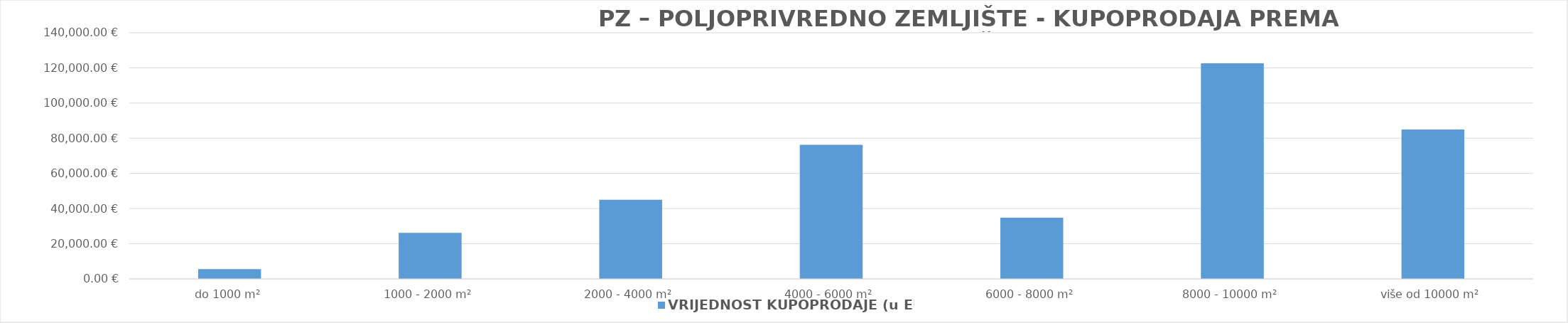
| Category | VRIJEDNOST KUPOPRODAJE (u EUR) |
|---|---|
| do 1000 m² | 5555.446 |
| 1000 - 2000 m² | 26201.806 |
| 2000 - 4000 m² | 45000 |
| 4000 - 6000 m² | 76254.211 |
| 6000 - 8000 m² | 34820 |
| 8000 - 10000 m² | 122600 |
| više od 10000 m² | 85000 |